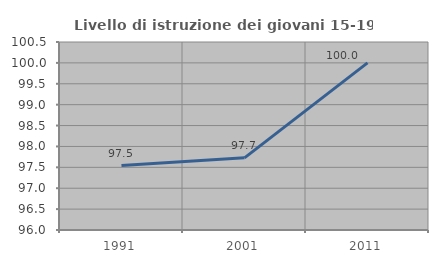
| Category | Livello di istruzione dei giovani 15-19 anni |
|---|---|
| 1991.0 | 97.541 |
| 2001.0 | 97.727 |
| 2011.0 | 100 |